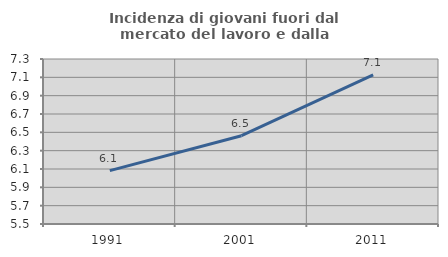
| Category | Incidenza di giovani fuori dal mercato del lavoro e dalla formazione  |
|---|---|
| 1991.0 | 6.082 |
| 2001.0 | 6.463 |
| 2011.0 | 7.127 |